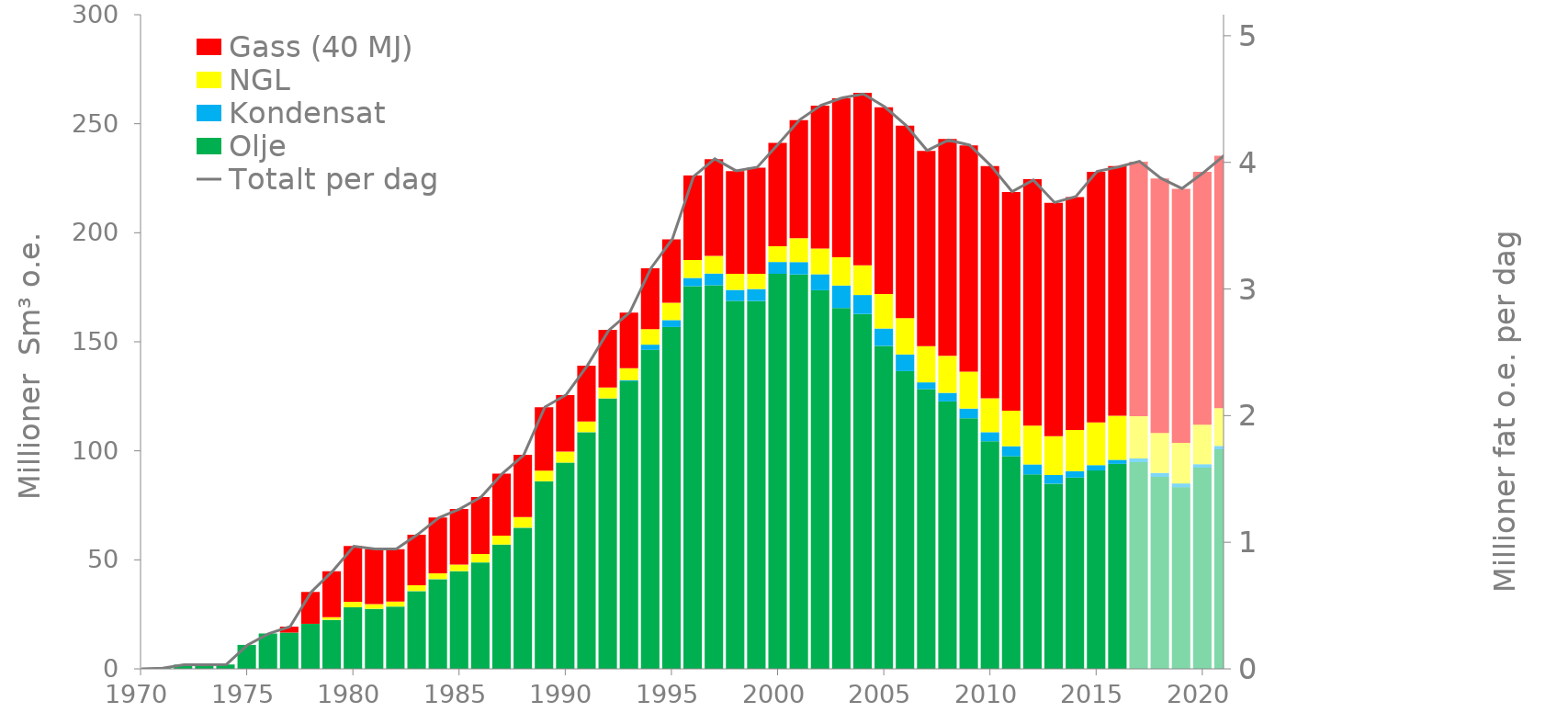
| Category | Olje | Kondensat | NGL | Gass (40 MJ) |
|---|---|---|---|---|
| 1970.0 | 0 | 0 | 0 | 0 |
| 1971.0 | 0.357 | 0 | 0 | 0 |
| 1972.0 | 1.927 | 0 | 0 | 0 |
| 1973.0 | 1.87 | 0 | 0 | 0 |
| 1974.0 | 2.014 | 0 | 0 | 0 |
| 1975.0 | 10.995 | 0 | 0 | 0 |
| 1976.0 | 16.227 | 0 | 0 | 0 |
| 1977.0 | 16.643 | 0.002 | 0 | 2.722 |
| 1978.0 | 20.644 | 0.021 | 0 | 14.617 |
| 1979.0 | 22.478 | 0.044 | 1.128 | 21.113 |
| 1980.0 | 28.221 | 0.048 | 2.44 | 25.637 |
| 1981.0 | 27.485 | 0.048 | 2.168 | 25.281 |
| 1982.0 | 28.528 | 0.043 | 2.286 | 24.059 |
| 1983.0 | 35.645 | 0.041 | 2.68 | 23.168 |
| 1984.0 | 41.093 | 0.064 | 2.642 | 25.635 |
| 1985.0 | 44.758 | 0.076 | 2.968 | 25.514 |
| 1986.0 | 48.771 | 0.061 | 3.845 | 26.147 |
| 1987.0 | 56.959 | 0.055 | 4.117 | 28.404 |
| 1988.0 | 64.723 | 0.047 | 4.846 | 28.585 |
| 1989.0 | 85.983 | 0.053 | 4.898 | 29.079 |
| 1990.0 | 94.542 | 0.048 | 5.011 | 25.986 |
| 1991.0 | 108.51 | 0.057 | 4.897 | 25.562 |
| 1992.0 | 123.999 | 0.054 | 4.959 | 26.5 |
| 1993.0 | 131.843 | 0.474 | 5.518 | 25.562 |
| 1994.0 | 146.282 | 2.403 | 7.122 | 27.879 |
| 1995.0 | 156.776 | 3.178 | 7.942 | 29.068 |
| 1996.0 | 175.501 | 3.784 | 8.232 | 38.749 |
| 1997.0 | 175.914 | 5.376 | 8.074 | 44.356 |
| 1998.0 | 168.744 | 5.047 | 7.39 | 47.055 |
| 1999.0 | 168.69 | 5.512 | 6.992 | 48.698 |
| 2000.0 | 181.181 | 5.411 | 7.225 | 47.432 |
| 2001.0 | 180.884 | 5.666 | 10.924 | 54.148 |
| 2002.0 | 173.649 | 7.323 | 11.798 | 65.533 |
| 2003.0 | 165.475 | 10.339 | 12.931 | 72.934 |
| 2004.0 | 162.778 | 8.675 | 13.602 | 79.095 |
| 2005.0 | 148.137 | 7.952 | 15.806 | 85.667 |
| 2006.0 | 136.577 | 7.625 | 16.696 | 88.227 |
| 2007.0 | 128.276 | 3.126 | 16.629 | 89.505 |
| 2008.0 | 122.662 | 3.924 | 16.942 | 99.463 |
| 2009.0 | 114.937 | 4.44 | 16.962 | 103.68 |
| 2010.0 | 104.388 | 4.163 | 15.505 | 106.533 |
| 2011.0 | 97.513 | 4.583 | 16.314 | 100.298 |
| 2012.0 | 89.197 | 4.575 | 17.799 | 113.058 |
| 2013.0 | 84.948 | 3.991 | 17.718 | 107.051 |
| 2014.0 | 87.741 | 2.913 | 18.949 | 106.796 |
| 2015.0 | 90.965 | 2.468 | 19.601 | 114.916 |
| 2016.0 | 94.009 | 1.879 | 20.176 | 114.525 |
| 2017.0 | 94.797 | 1.733 | 19.375 | 116.648 |
| 2018.0 | 88.054 | 1.759 | 18.421 | 116.623 |
| 2019.0 | 83.298 | 1.744 | 18.56 | 116.543 |
| 2020.0 | 92.231 | 1.6 | 18.132 | 115.999 |
| 2021.0 | 100.653 | 1.574 | 17.325 | 115.813 |